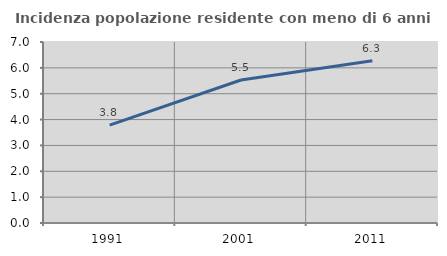
| Category | Incidenza popolazione residente con meno di 6 anni |
|---|---|
| 1991.0 | 3.786 |
| 2001.0 | 5.53 |
| 2011.0 | 6.271 |